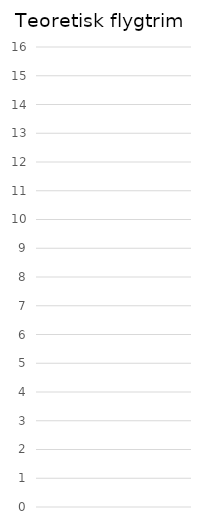
| Category | God teoretisk trim | I behov av uppfräschning | Ringrostig |
|---|---|---|---|
| 0 | 0 | 0 | 0 |